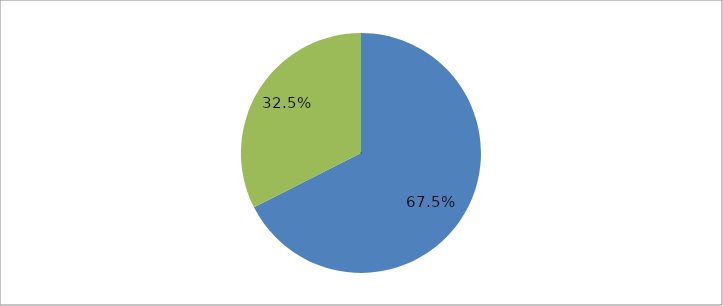
| Category | Series 0 |
|---|---|
| 0 | 0.675 |
| 1 | 0.325 |